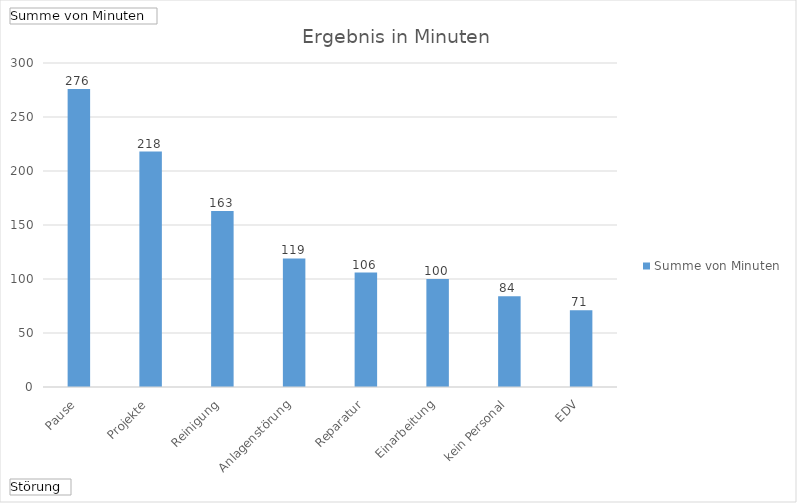
| Category | Ergebnis |
|---|---|
| Pause | 276 |
| Projekte | 218 |
| Reinigung | 163 |
| Anlagenstörung | 119 |
| Reparatur | 106 |
| Einarbeitung | 100 |
| kein Personal | 84 |
| EDV | 71 |